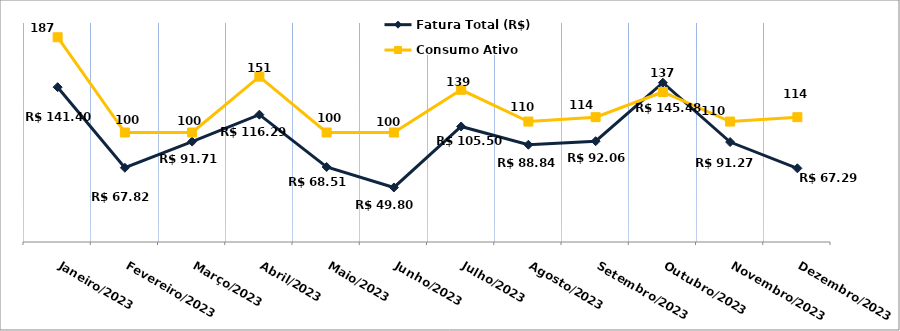
| Category | Fatura Total (R$) |
|---|---|
| Janeiro/2023 | 141.4 |
| Fevereiro/2023 | 67.82 |
| Março/2023 | 91.71 |
| Abril/2023 | 116.29 |
| Maio/2023 | 68.51 |
| Junho/2023 | 49.8 |
| Julho/2023 | 105.5 |
| Agosto/2023 | 88.84 |
| Setembro/2023 | 92.06 |
| Outubro/2023 | 145.48 |
| Novembro/2023 | 91.27 |
| Dezembro/2023 | 67.29 |